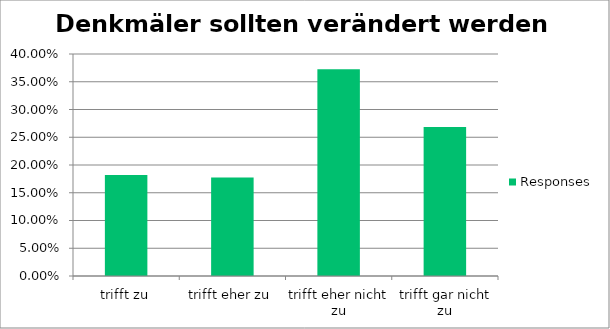
| Category | Responses |
|---|---|
| trifft zu | 0.182 |
| trifft eher zu | 0.178 |
| trifft eher nicht zu | 0.372 |
| trifft gar nicht zu | 0.268 |